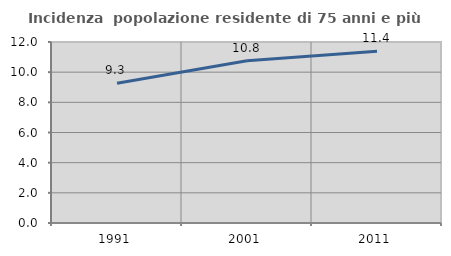
| Category | Incidenza  popolazione residente di 75 anni e più |
|---|---|
| 1991.0 | 9.262 |
| 2001.0 | 10.758 |
| 2011.0 | 11.386 |